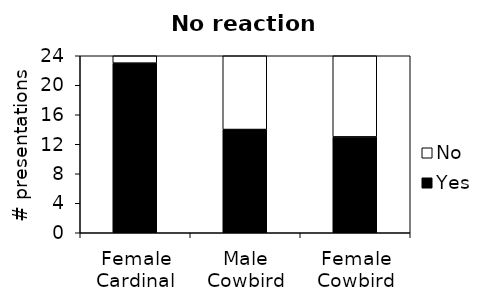
| Category | Yes | No |
|---|---|---|
| Female Cardinal | 23 | 1 |
| Male Cowbird | 14 | 10 |
| Female Cowbird | 13 | 11 |